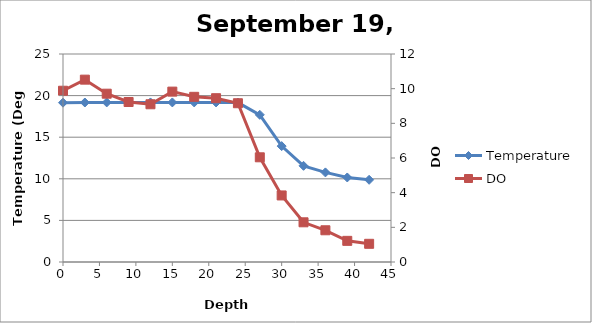
| Category | Temperature |
|---|---|
| 0.0 | 19.15 |
| 3.0 | 19.17 |
| 6.0 | 19.18 |
| 9.0 | 19.18 |
| 12.0 | 19.18 |
| 15.0 | 19.18 |
| 18.0 | 19.18 |
| 21.0 | 19.18 |
| 24.0 | 19.16 |
| 27.0 | 17.69 |
| 30.0 | 13.93 |
| 33.0 | 11.56 |
| 36.0 | 10.77 |
| 39.0 | 10.16 |
| 42.0 | 9.88 |